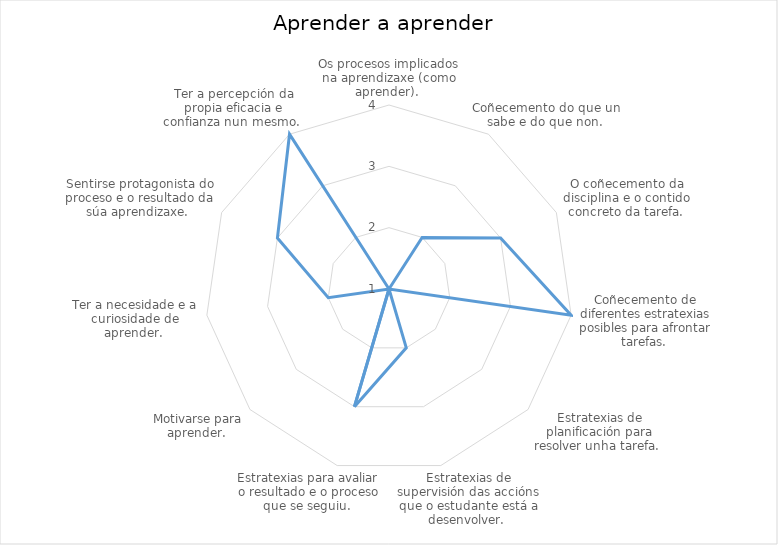
| Category | Series 0 |
|---|---|
| Os procesos implicados na aprendizaxe (como aprender).  | 1 |
| Coñecemento do que un sabe e do que non.  | 2 |
| O coñecemento da disciplina e o contido concreto da tarefa.  | 3 |
| Coñecemento de diferentes estratexias posibles para afrontar tarefas.  | 4 |
| Estratexias de planificación para resolver unha tarefa.  | 1 |
| Estratexias de supervisión das accións que o estudante está a desenvolver.  | 2 |
| Estratexias para avaliar o resultado e o proceso que se seguiu.  | 3 |
| Motivarse para aprender.  | 1 |
| Ter a necesidade e a curiosidade de aprender.  | 2 |
| Sentirse protagonista do proceso e o resultado da súa aprendizaxe.  | 3 |
| Ter a percepción da propia eficacia e confianza nun mesmo.  | 4 |